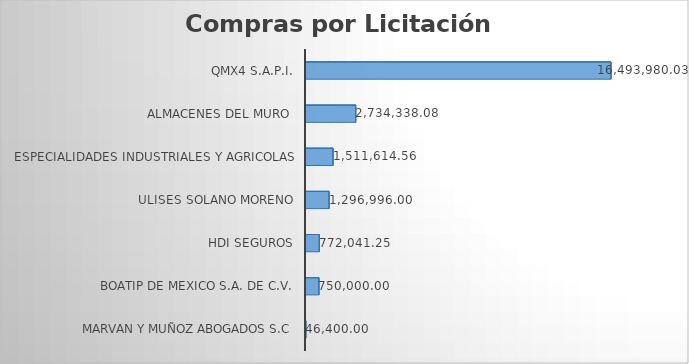
| Category | Series 0 |
|---|---|
| MARVAN Y MUÑOZ ABOGADOS S.C | 46400 |
| BOATIP DE MEXICO S.A. DE C.V. | 750000 |
| HDI SEGUROS | 772041.25 |
| ULISES SOLANO MORENO | 1296996 |
| ESPECIALIDADES INDUSTRIALES Y AGRICOLAS | 1511614.56 |
| ALMACENES DEL MURO  | 2734338.08 |
| QMX4 S.A.P.I. | 16493980.03 |